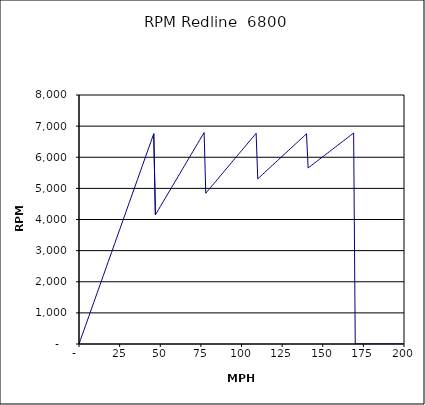
| Category | RPM Redline  6800 |
|---|---|
| 0.0 | 0 |
| 1.0 | 146.894 |
| 2.0 | 293.787 |
| 3.0 | 440.681 |
| 4.0 | 587.574 |
| 5.0 | 734.468 |
| 6.0 | 881.362 |
| 7.0 | 1028.255 |
| 8.0 | 1175.149 |
| 9.0 | 1322.042 |
| 10.0 | 1468.936 |
| 11.0 | 1615.83 |
| 12.0 | 1762.723 |
| 13.0 | 1909.617 |
| 14.0 | 2056.51 |
| 15.0 | 2203.404 |
| 16.0 | 2350.298 |
| 17.0 | 2497.191 |
| 18.0 | 2644.085 |
| 19.0 | 2790.978 |
| 20.0 | 2937.872 |
| 21.0 | 3084.766 |
| 22.0 | 3231.659 |
| 23.0 | 3378.553 |
| 24.0 | 3525.446 |
| 25.0 | 3672.34 |
| 26.0 | 3819.234 |
| 27.0 | 3966.127 |
| 28.0 | 4113.021 |
| 29.0 | 4259.914 |
| 30.0 | 4406.808 |
| 31.0 | 4553.702 |
| 32.0 | 4700.595 |
| 33.0 | 4847.489 |
| 34.0 | 4994.382 |
| 35.0 | 5141.276 |
| 36.0 | 5288.17 |
| 37.0 | 5435.063 |
| 38.0 | 5581.957 |
| 39.0 | 5728.85 |
| 40.0 | 5875.744 |
| 41.0 | 6022.638 |
| 42.0 | 6169.531 |
| 43.0 | 6316.425 |
| 44.0 | 6463.318 |
| 45.0 | 6610.212 |
| 46.0 | 6757.106 |
| 47.0 | 4147.717 |
| 48.0 | 4235.966 |
| 49.0 | 4324.216 |
| 50.0 | 4412.465 |
| 51.0 | 4500.714 |
| 52.0 | 4588.964 |
| 53.0 | 4677.213 |
| 54.0 | 4765.462 |
| 55.0 | 4853.711 |
| 56.0 | 4941.961 |
| 57.0 | 5030.21 |
| 58.0 | 5118.459 |
| 59.0 | 5206.709 |
| 60.0 | 5294.958 |
| 61.0 | 5383.207 |
| 62.0 | 5471.457 |
| 63.0 | 5559.706 |
| 64.0 | 5647.955 |
| 65.0 | 5736.204 |
| 66.0 | 5824.454 |
| 67.0 | 5912.703 |
| 68.0 | 6000.952 |
| 69.0 | 6089.202 |
| 70.0 | 6177.451 |
| 71.0 | 6265.7 |
| 72.0 | 6353.95 |
| 73.0 | 6442.199 |
| 74.0 | 6530.448 |
| 75.0 | 6618.697 |
| 76.0 | 6706.947 |
| 77.0 | 6795.196 |
| 78.0 | 4843.906 |
| 79.0 | 4906.007 |
| 80.0 | 4968.109 |
| 81.0 | 5030.21 |
| 82.0 | 5092.311 |
| 83.0 | 5154.413 |
| 84.0 | 5216.514 |
| 85.0 | 5278.616 |
| 86.0 | 5340.717 |
| 87.0 | 5402.818 |
| 88.0 | 5464.92 |
| 89.0 | 5527.021 |
| 90.0 | 5589.122 |
| 91.0 | 5651.224 |
| 92.0 | 5713.325 |
| 93.0 | 5775.426 |
| 94.0 | 5837.528 |
| 95.0 | 5899.629 |
| 96.0 | 5961.73 |
| 97.0 | 6023.832 |
| 98.0 | 6085.933 |
| 99.0 | 6148.035 |
| 100.0 | 6210.136 |
| 101.0 | 6272.237 |
| 102.0 | 6334.339 |
| 103.0 | 6396.44 |
| 104.0 | 6458.541 |
| 105.0 | 6520.643 |
| 106.0 | 6582.744 |
| 107.0 | 6644.845 |
| 108.0 | 6706.947 |
| 109.0 | 6769.048 |
| 110.0 | 5306.339 |
| 111.0 | 5354.579 |
| 112.0 | 5402.818 |
| 113.0 | 5451.058 |
| 114.0 | 5499.297 |
| 115.0 | 5547.537 |
| 116.0 | 5595.776 |
| 117.0 | 5644.015 |
| 118.0 | 5692.255 |
| 119.0 | 5740.494 |
| 120.0 | 5788.734 |
| 121.0 | 5836.973 |
| 122.0 | 5885.213 |
| 123.0 | 5933.452 |
| 124.0 | 5981.692 |
| 125.0 | 6029.931 |
| 126.0 | 6078.171 |
| 127.0 | 6126.41 |
| 128.0 | 6174.649 |
| 129.0 | 6222.889 |
| 130.0 | 6271.128 |
| 131.0 | 6319.368 |
| 132.0 | 6367.607 |
| 133.0 | 6415.847 |
| 134.0 | 6464.086 |
| 135.0 | 6512.326 |
| 136.0 | 6560.565 |
| 137.0 | 6608.804 |
| 138.0 | 6657.044 |
| 139.0 | 6705.283 |
| 140.0 | 6753.523 |
| 141.0 | 5655.105 |
| 142.0 | 5695.212 |
| 143.0 | 5735.319 |
| 144.0 | 5775.426 |
| 145.0 | 5815.534 |
| 146.0 | 5855.641 |
| 147.0 | 5895.748 |
| 148.0 | 5935.855 |
| 149.0 | 5975.962 |
| 150.0 | 6016.069 |
| 151.0 | 6056.176 |
| 152.0 | 6096.283 |
| 153.0 | 6136.391 |
| 154.0 | 6176.498 |
| 155.0 | 6216.605 |
| 156.0 | 6256.712 |
| 157.0 | 6296.819 |
| 158.0 | 6336.926 |
| 159.0 | 6377.033 |
| 160.0 | 6417.14 |
| 161.0 | 6457.248 |
| 162.0 | 6497.355 |
| 163.0 | 6537.462 |
| 164.0 | 6577.569 |
| 165.0 | 6617.676 |
| 166.0 | 6657.783 |
| 167.0 | 6697.89 |
| 168.0 | 6737.997 |
| 169.0 | 6778.105 |
| 170.0 | 0 |
| 171.0 | 0 |
| 172.0 | 0 |
| 173.0 | 0 |
| 174.0 | 0 |
| 175.0 | 0 |
| 176.0 | 0 |
| 177.0 | 0 |
| 178.0 | 0 |
| 179.0 | 0 |
| 180.0 | 0 |
| 181.0 | 0 |
| 182.0 | 0 |
| 183.0 | 0 |
| 184.0 | 0 |
| 185.0 | 0 |
| 186.0 | 0 |
| 187.0 | 0 |
| 188.0 | 0 |
| 189.0 | 0 |
| 190.0 | 0 |
| 191.0 | 0 |
| 192.0 | 0 |
| 193.0 | 0 |
| 194.0 | 0 |
| 195.0 | 0 |
| 196.0 | 0 |
| 197.0 | 0 |
| 198.0 | 0 |
| 199.0 | 0 |
| 200.0 | 0 |